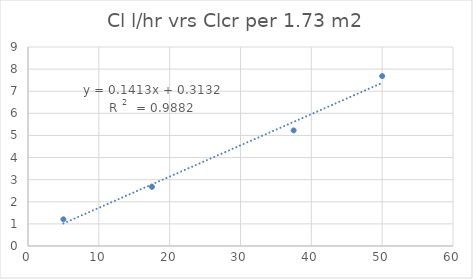
| Category | Series 0 |
|---|---|
| 50.0 | 7.685 |
| 37.5 | 5.228 |
| 17.5 | 2.675 |
| 5.0 | 1.206 |